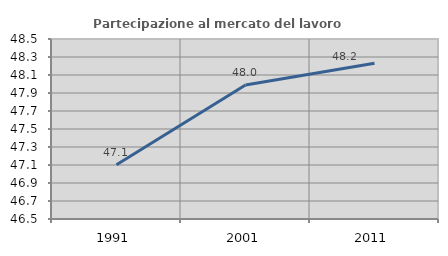
| Category | Partecipazione al mercato del lavoro  femminile |
|---|---|
| 1991.0 | 47.104 |
| 2001.0 | 47.988 |
| 2011.0 | 48.23 |